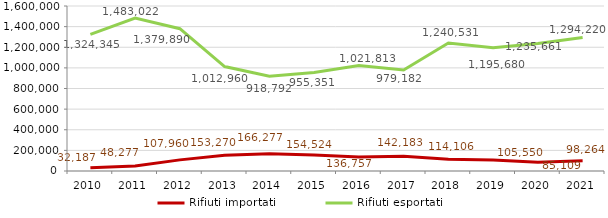
| Category | Rifiuti importati | Rifiuti esportati |
|---|---|---|
| 2010.0 | 32187 | 1324345 |
| 2011.0 | 48277 | 1483022 |
| 2012.0 | 107960 | 1379890 |
| 2013.0 | 153270 | 1012960 |
| 2014.0 | 166277 | 918792 |
| 2015.0 | 154524 | 955351 |
| 2016.0 | 136757 | 1021813 |
| 2017.0 | 142183 | 979182 |
| 2018.0 | 114106 | 1240531 |
| 2019.0 | 105550 | 1195680 |
| 2020.0 | 85109 | 1235661 |
| 2021.0 | 98264 | 1294220 |